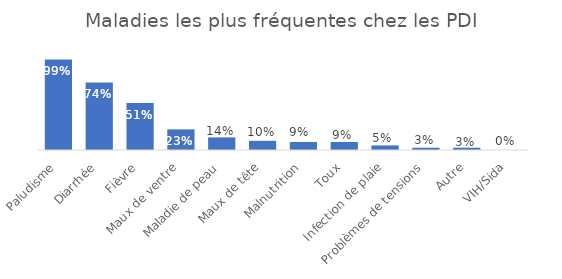
| Category | Frequence |
|---|---|
| Paludisme | 0.988 |
| Diarrhée | 0.738 |
| Fièvre | 0.512 |
| Maux de ventre | 0.225 |
| Maladie de peau | 0.138 |
| Maux de tête | 0.1 |
| Malnutrition | 0.088 |
| Toux | 0.088 |
| Infection de plaie | 0.05 |
| Problèmes de tensions | 0.025 |
| Autre | 0.025 |
| VIH/Sida | 0 |